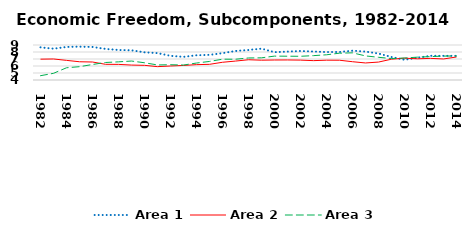
| Category | Area 1 | Area 2 | Area 3 |
|---|---|---|---|
| 1982.0 | 8.666 | 6.977 | 4.612 |
| 1983.0 | 8.472 | 7.004 | 4.955 |
| 1984.0 | 8.719 | 6.805 | 5.747 |
| 1985.0 | 8.764 | 6.605 | 5.902 |
| 1986.0 | 8.717 | 6.57 | 6.215 |
| 1987.0 | 8.444 | 6.24 | 6.502 |
| 1988.0 | 8.284 | 6.231 | 6.594 |
| 1989.0 | 8.244 | 6.132 | 6.708 |
| 1990.0 | 7.955 | 6.095 | 6.463 |
| 1991.0 | 7.842 | 5.907 | 6.149 |
| 1992.0 | 7.451 | 5.999 | 6.182 |
| 1993.0 | 7.31 | 6.08 | 6.137 |
| 1994.0 | 7.528 | 6.193 | 6.424 |
| 1995.0 | 7.596 | 6.239 | 6.651 |
| 1996.0 | 7.833 | 6.531 | 6.972 |
| 1997.0 | 8.146 | 6.704 | 6.967 |
| 1998.0 | 8.287 | 6.895 | 7.149 |
| 1999.0 | 8.479 | 6.83 | 7.169 |
| 2000.0 | 7.973 | 6.856 | 7.412 |
| 2001.0 | 8.058 | 6.862 | 7.398 |
| 2002.0 | 8.143 | 6.841 | 7.387 |
| 2003.0 | 8.07 | 6.767 | 7.481 |
| 2004.0 | 7.996 | 6.831 | 7.602 |
| 2005.0 | 8.001 | 6.825 | 7.832 |
| 2006.0 | 8.189 | 6.613 | 7.88 |
| 2007.0 | 8.056 | 6.435 | 7.442 |
| 2008.0 | 7.783 | 6.562 | 7.242 |
| 2009.0 | 7.289 | 6.972 | 7.065 |
| 2010.0 | 6.889 | 7.117 | 7.14 |
| 2011.0 | 7.181 | 7.027 | 7.263 |
| 2012.0 | 7.456 | 7.09 | 7.339 |
| 2013.0 | 7.452 | 7.006 | 7.417 |
| 2014.0 | 7.455 | 7.289 | 7.429 |